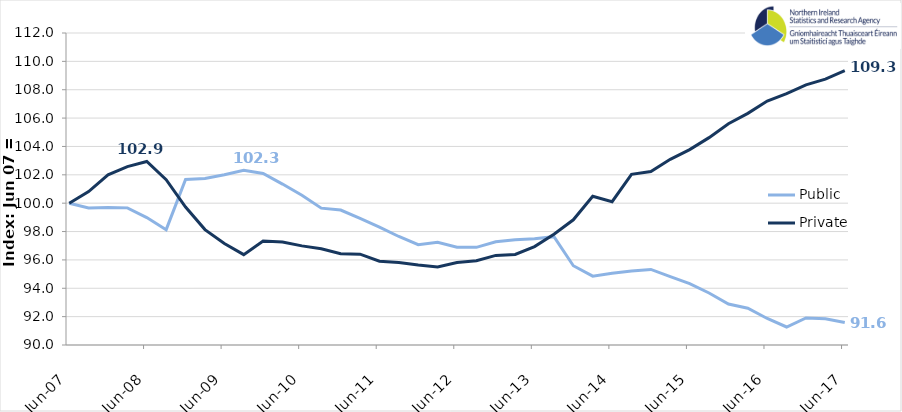
| Category | Public | Private |
|---|---|---|
| 2007-06-01 | 100 | 100 |
| 2007-09-01 | 99.655 | 100.821 |
| 2007-12-01 | 99.701 | 102.002 |
| 2008-03-01 | 99.669 | 102.578 |
| 2008-06-01 | 98.987 | 102.94 |
| 2008-09-01 | 98.133 | 101.66 |
| 2008-12-01 | 101.671 | 99.727 |
| 2009-03-01 | 101.747 | 98.137 |
| 2009-06-01 | 102.001 | 97.158 |
| 2009-09-01 | 102.317 | 96.373 |
| 2009-12-01 | 102.094 | 97.34 |
| 2010-03-01 | 101.347 | 97.267 |
| 2010-06-01 | 100.556 | 96.989 |
| 2010-09-01 | 99.649 | 96.785 |
| 2010-12-01 | 99.517 | 96.435 |
| 2011-03-01 | 98.93 | 96.404 |
| 2011-06-01 | 98.31 | 95.909 |
| 2011-09-01 | 97.651 | 95.82 |
| 2011-12-01 | 97.076 | 95.638 |
| 2012-03-01 | 97.237 | 95.505 |
| 2012-06-01 | 96.888 | 95.822 |
| 2012-09-01 | 96.887 | 95.942 |
| 2012-12-01 | 97.277 | 96.319 |
| 2013-03-01 | 97.421 | 96.384 |
| 2013-06-01 | 97.491 | 96.94 |
| 2013-09-01 | 97.64 | 97.813 |
| 2013-12-01 | 95.59 | 98.829 |
| 2014-03-01 | 94.852 | 100.485 |
| 2014-06-01 | 95.061 | 100.106 |
| 2014-09-01 | 95.215 | 102.037 |
| 2014-12-01 | 95.327 | 102.231 |
| 2015-03-01 | 94.817 | 103.095 |
| 2015-06-01 | 94.333 | 103.779 |
| 2015-09-01 | 93.669 | 104.621 |
| 2015-12-01 | 92.891 | 105.605 |
| 2016-03-01 | 92.595 | 106.335 |
| 2016-06-01 | 91.869 | 107.203 |
| 2016-09-01 | 91.27 | 107.722 |
| 2016-12-01 | 91.91 | 108.345 |
| 2017-03-01 | 91.844 | 108.747 |
| 2017-06-01 | 91.585 | 109.34 |